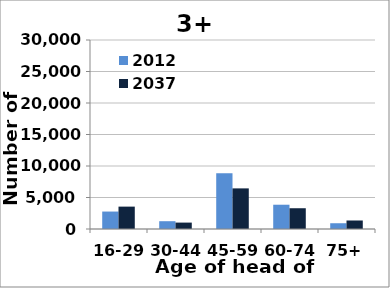
| Category | 2012 | 2037 |
|---|---|---|
| 16-29 | 2770 | 3553 |
| 30-44 | 1237 | 1017 |
| 45-59 | 8841 | 6447 |
| 60-74 | 3854 | 3296 |
| 75+ | 915 | 1351 |